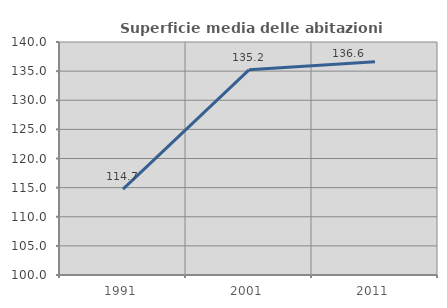
| Category | Superficie media delle abitazioni occupate |
|---|---|
| 1991.0 | 114.743 |
| 2001.0 | 135.227 |
| 2011.0 | 136.598 |